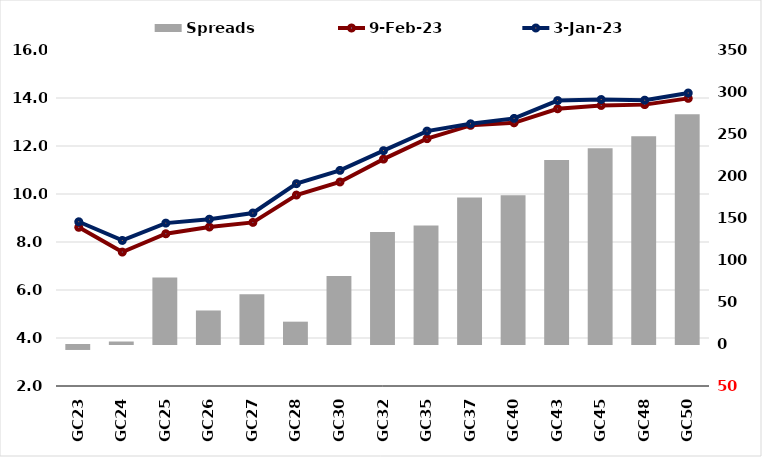
| Category |  Spreads   |
|---|---|
| GC23 | -5.916 |
| GC24 | 2.962 |
| GC25 | 79.29 |
| GC26 | 39.897 |
| GC27 | 59.163 |
| GC28 | 26.584 |
| GC30 | 81.089 |
| GC32 | 133.281 |
| GC35 | 140.98 |
| GC37 | 174.481 |
| GC40 | 177.075 |
| GC43 | 218.968 |
| GC45 | 232.902 |
| GC48 | 247.399 |
| GC50 | 273.367 |